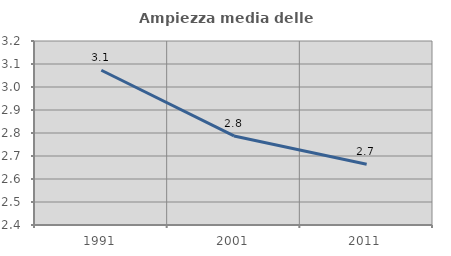
| Category | Ampiezza media delle famiglie |
|---|---|
| 1991.0 | 3.073 |
| 2001.0 | 2.787 |
| 2011.0 | 2.664 |